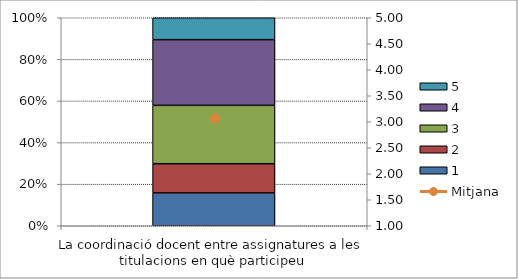
| Category | 1 | 2 | 3 | 4 | 5 |
|---|---|---|---|---|---|
| La coordinació docent entre assignatures a les titulacions en què participeu | 9 | 8 | 16 | 18 | 6 |